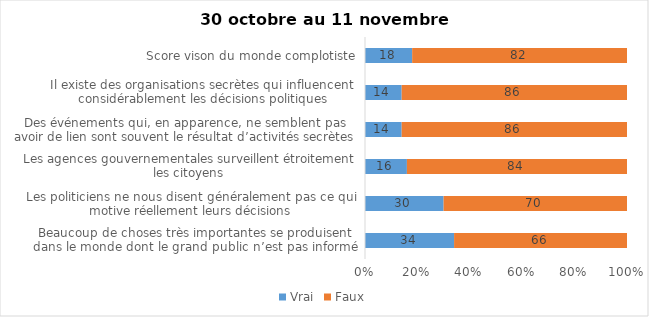
| Category | Vrai | Faux |
|---|---|---|
| Beaucoup de choses très importantes se produisent dans le monde dont le grand public n’est pas informé | 34 | 66 |
| Les politiciens ne nous disent généralement pas ce qui motive réellement leurs décisions | 30 | 70 |
| Les agences gouvernementales surveillent étroitement les citoyens | 16 | 84 |
| Des événements qui, en apparence, ne semblent pas avoir de lien sont souvent le résultat d’activités secrètes | 14 | 86 |
| Il existe des organisations secrètes qui influencent considérablement les décisions politiques | 14 | 86 |
| Score vison du monde complotiste | 18 | 82 |